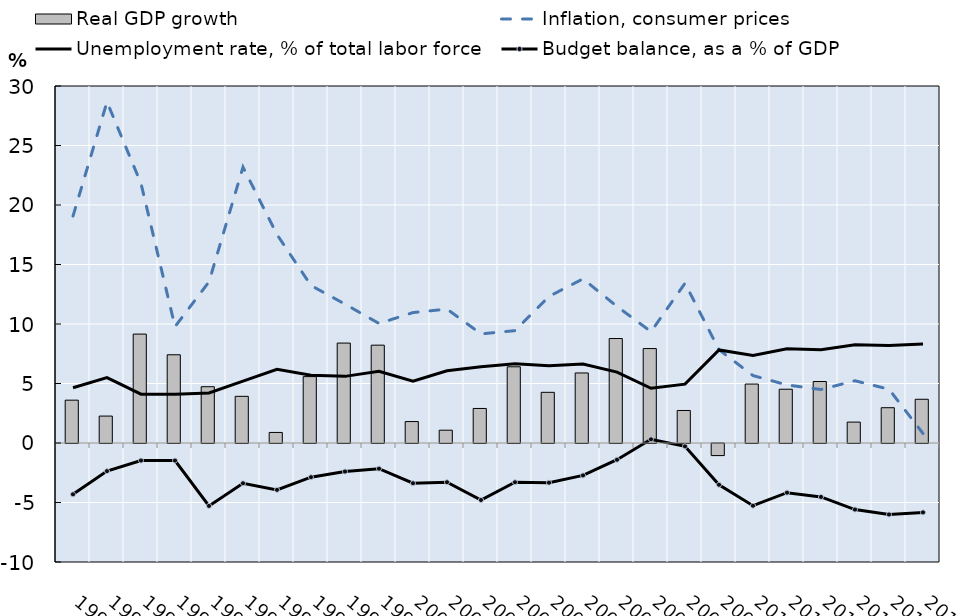
| Category | Real GDP growth |
|---|---|
| 1990.0 | 3.6 |
| 1991.0 | 2.263 |
| 1992.0 | 9.152 |
| 1993.0 | 7.414 |
| 1994.0 | 4.73 |
| 1995.0 | 3.921 |
| 1996.0 | 0.887 |
| 1997.0 | 5.578 |
| 1998.0 | 8.398 |
| 1999.0 | 8.222 |
| 2000.0 | 1.801 |
| 2001.0 | 1.076 |
| 2002.0 | 2.902 |
| 2003.0 | 6.405 |
| 2004.0 | 4.259 |
| 2005.0 | 5.886 |
| 2006.0 | 8.78 |
| 2007.0 | 7.935 |
| 2008.0 | 2.732 |
| 2009.0 | -1.016 |
| 2010.0 | 4.954 |
| 2011.0 | 4.518 |
| 2012.0 | 5.168 |
| 2013.0 | 1.756 |
| 2014.0 | 2.965 |
| 2015.0 | 3.675 |